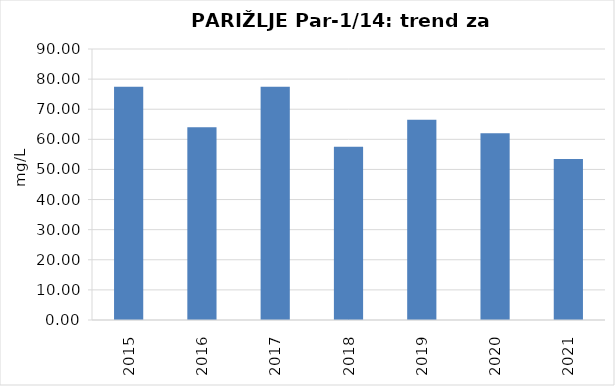
| Category | Vsota |
|---|---|
| 2015 | 77.5 |
| 2016 | 64 |
| 2017 | 77.5 |
| 2018 | 57.5 |
| 2019 | 66.5 |
| 2020 | 62 |
| 2021 | 53.5 |